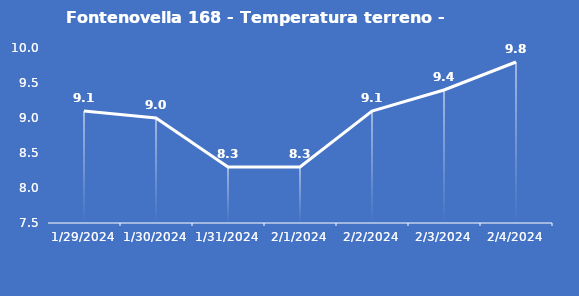
| Category | Fontenovella 168 - Temperatura terreno - Grezzo (°C) |
|---|---|
| 1/29/24 | 9.1 |
| 1/30/24 | 9 |
| 1/31/24 | 8.3 |
| 2/1/24 | 8.3 |
| 2/2/24 | 9.1 |
| 2/3/24 | 9.4 |
| 2/4/24 | 9.8 |